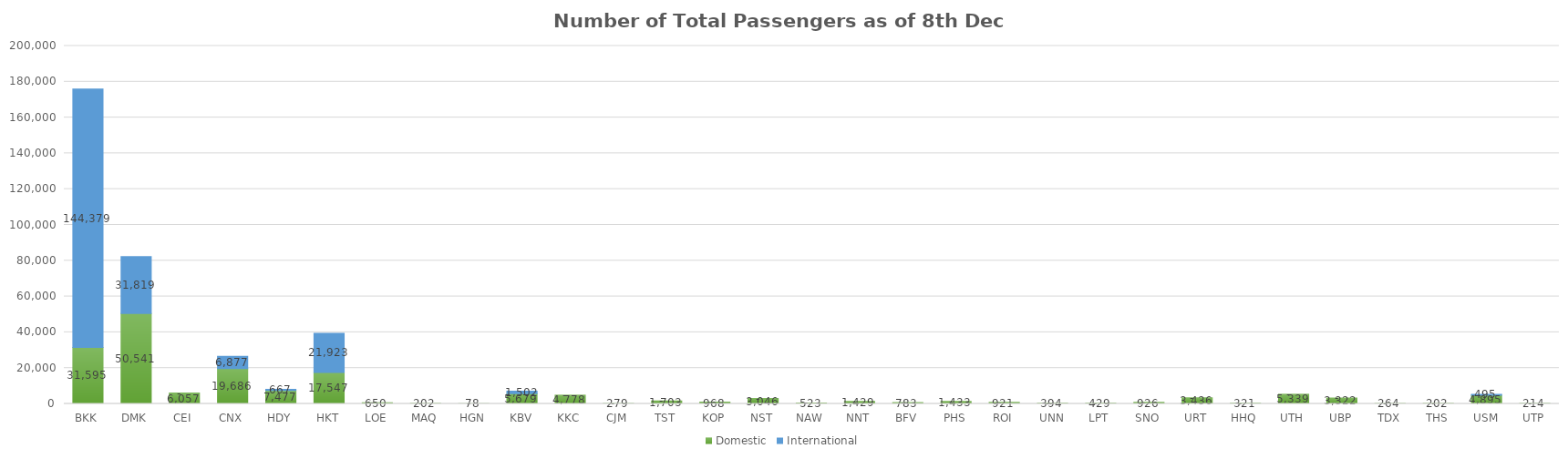
| Category | Domestic | International |
|---|---|---|
| BKK | 31595 | 144379 |
| DMK | 50541 | 31819 |
| CEI | 6057 | 0 |
| CNX | 19686 | 6877 |
| HDY | 7477 | 667 |
| HKT | 17547 | 21923 |
| LOE | 650 | 0 |
| MAQ | 202 | 0 |
| HGN | 78 | 0 |
| KBV | 5679 | 1502 |
| KKC | 4778 | 0 |
| CJM | 279 | 0 |
| TST | 1703 | 0 |
| KOP | 968 | 0 |
| NST | 3046 | 0 |
| NAW | 523 | 0 |
| NNT | 1429 | 0 |
| BFV | 783 | 0 |
| PHS | 1433 | 0 |
| ROI | 921 | 0 |
| UNN | 394 | 0 |
| LPT | 429 | 0 |
| SNO | 926 | 0 |
| URT | 3436 | 0 |
| HHQ | 321 | 0 |
| UTH | 5339 | 0 |
| UBP | 3322 | 0 |
| TDX | 264 | 0 |
| THS | 202 | 0 |
| USM | 4895 | 495 |
| UTP | 214 | 0 |